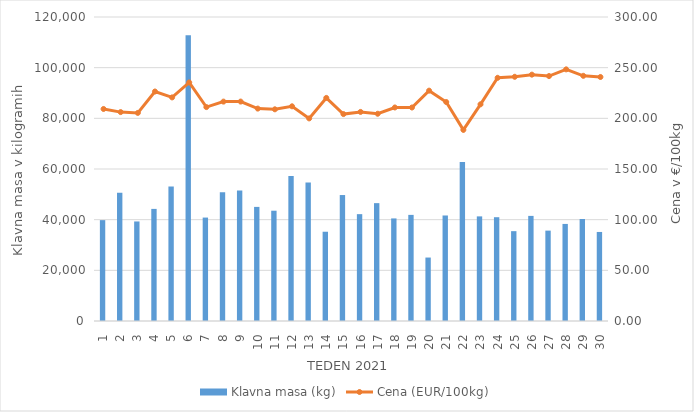
| Category | Klavna masa (kg) |
|---|---|
| 1.0 | 39814 |
| 2.0 | 50603 |
| 3.0 | 39295 |
| 4.0 | 44250 |
| 5.0 | 53061 |
| 6.0 | 112816 |
| 7.0 | 40829 |
| 8.0 | 50775 |
| 9.0 | 51535 |
| 10.0 | 45040 |
| 11.0 | 43536 |
| 12.0 | 57246 |
| 13.0 | 54680 |
| 14.0 | 35237 |
| 15.0 | 49721 |
| 16.0 | 42177 |
| 17.0 | 46525 |
| 18.0 | 40491 |
| 19.0 | 41888 |
| 20.0 | 25048 |
| 21.0 | 41651 |
| 22.0 | 62774 |
| 23.0 | 41297 |
| 24.0 | 40971 |
| 25.0 | 35465 |
| 26.0 | 41489 |
| 27.0 | 35675 |
| 28.0 | 38316 |
| 29.0 | 40265 |
| 30.0 | 35146 |